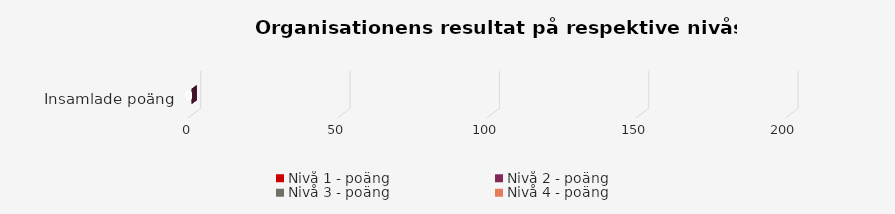
| Category | Nivå 1 - poäng | Nivå 2 - poäng | Nivå 3 - poäng | Nivå 4 - poäng |
|---|---|---|---|---|
| Insamlade poäng | 0 | 0 | 0 | 0 |